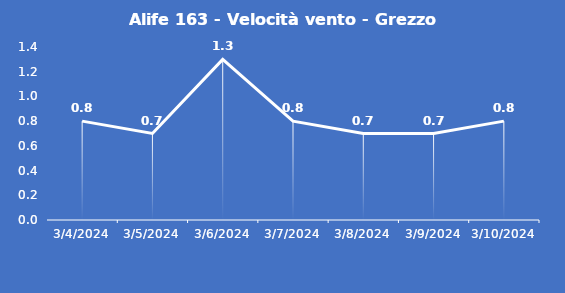
| Category | Alife 163 - Velocità vento - Grezzo (m/s) |
|---|---|
| 3/4/24 | 0.8 |
| 3/5/24 | 0.7 |
| 3/6/24 | 1.3 |
| 3/7/24 | 0.8 |
| 3/8/24 | 0.7 |
| 3/9/24 | 0.7 |
| 3/10/24 | 0.8 |